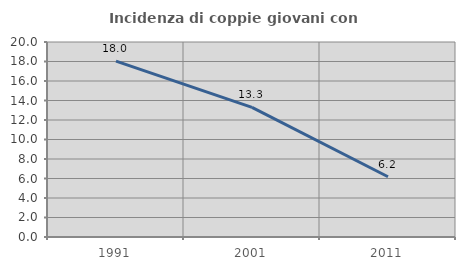
| Category | Incidenza di coppie giovani con figli |
|---|---|
| 1991.0 | 18.041 |
| 2001.0 | 13.291 |
| 2011.0 | 6.181 |